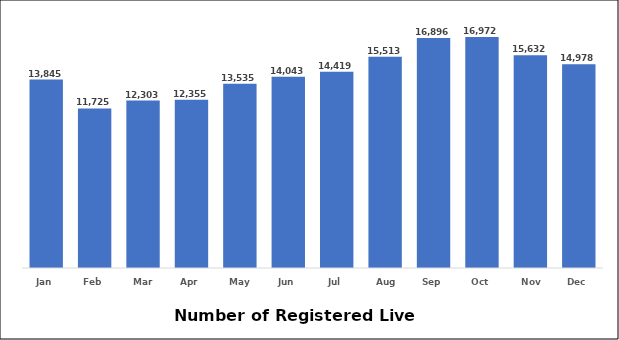
| Category | Series 0 |
|---|---|
| Jan | 13845 |
| Feb | 11725 |
| Mar | 12303 |
| Apr | 12355 |
| May | 13535 |
| Jun | 14043 |
| Jul | 14419 |
| Aug | 15513 |
| Sep | 16896 |
| Oct | 16972 |
| Nov | 15632 |
| Dec | 14978 |